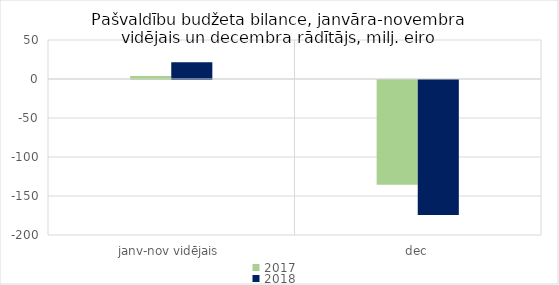
| Category | 2017 | 2018 |
|---|---|---|
| janv-nov vidējais | 3940.636 | 21438.737 |
| dec | -134394.788 | -172941.944 |